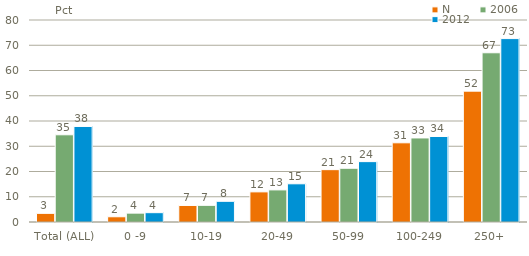
| Category | N | 2006 | 2012 |
|---|---|---|---|
| Total (ALL) | 3.426 | 34.541 | 37.838 |
| 0 -9 | 2.068 | 3.512 | 3.694 |
| 10-19 | 6.546 | 6.597 | 8.197 |
| 20-49 | 11.935 | 12.712 | 15.129 |
| 50-99 | 20.725 | 21.279 | 23.906 |
| 100-249 | 31.362 | 33.291 | 33.862 |
| 250+ | 51.825 | 67.019 | 72.631 |